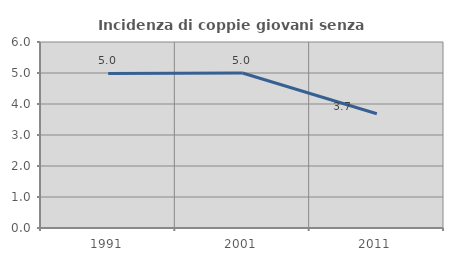
| Category | Incidenza di coppie giovani senza figli |
|---|---|
| 1991.0 | 4.985 |
| 2001.0 | 5 |
| 2011.0 | 3.684 |